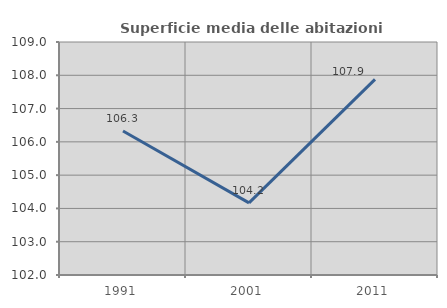
| Category | Superficie media delle abitazioni occupate |
|---|---|
| 1991.0 | 106.326 |
| 2001.0 | 104.167 |
| 2011.0 | 107.876 |